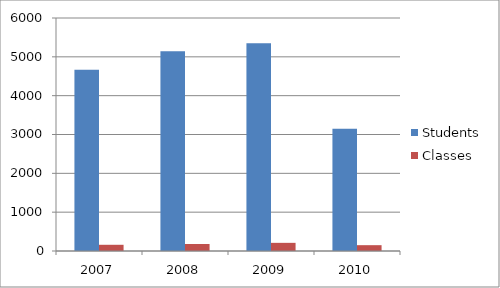
| Category | Students | Classes |
|---|---|---|
| 2007.0 | 4667 | 160 |
| 2008.0 | 5143 | 180 |
| 2009.0 | 5350 | 210 |
| 2010.0 | 3150 | 150 |